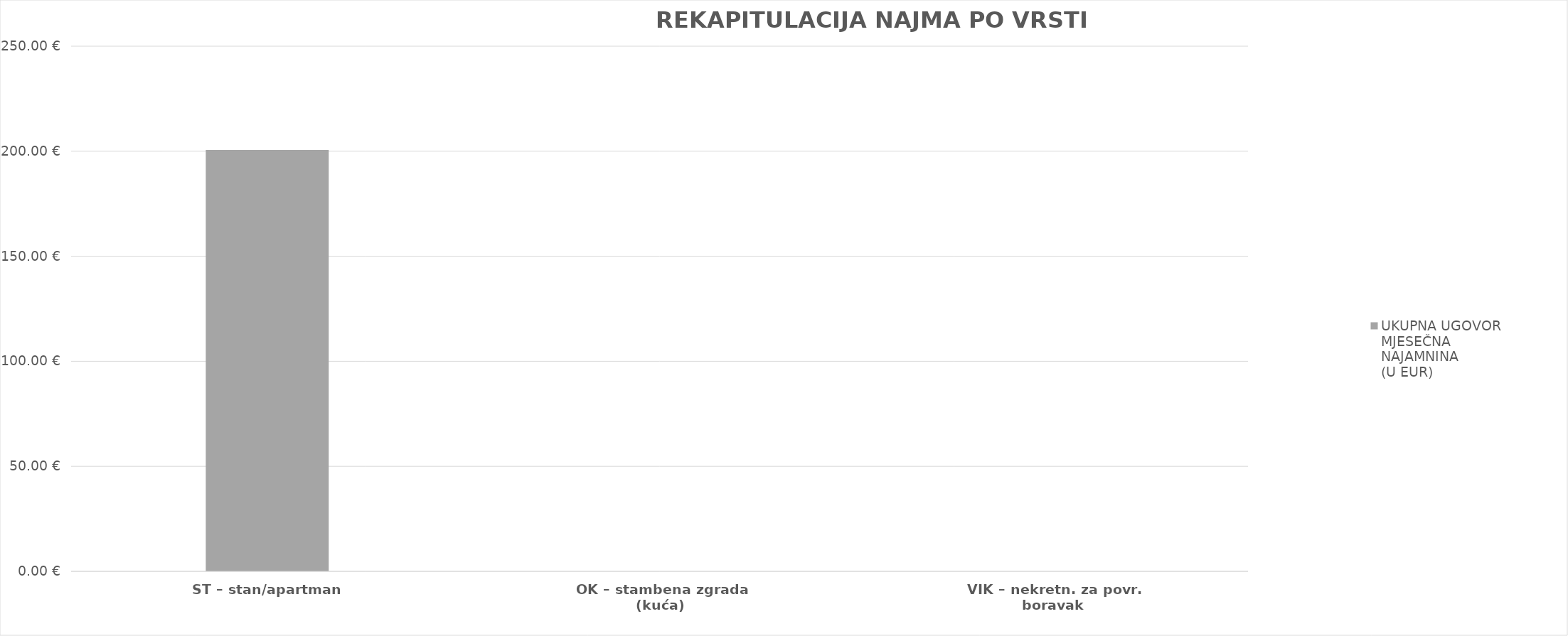
| Category | UKUPNA UGOVORENA MJESEČNA NAJAMNINA 
(U EUR) |
|---|---|
| ST – stan/apartman | 200.573 |
| OK – stambena zgrada (kuća) | 0 |
| VIK – nekretn. za povr. boravak | 0 |